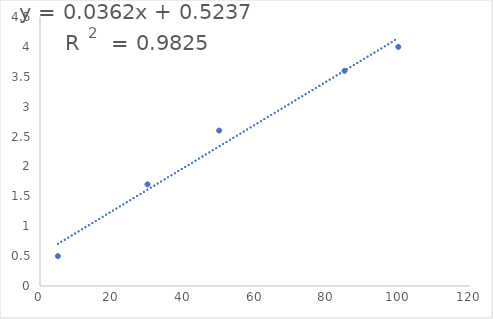
| Category | Series 0 |
|---|---|
| 5.0 | 0.5 |
| 30.0 | 1.7 |
| 50.0 | 2.6 |
| 85.0 | 3.6 |
| 100.0 | 4 |